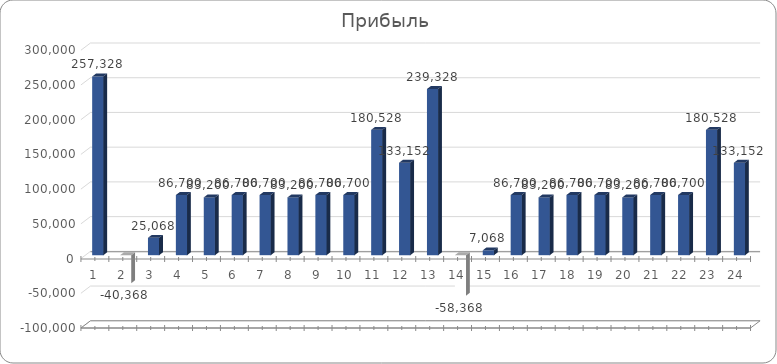
| Category | Series 0 |
|---|---|
| 0 | 257328 |
| 1 | -40368 |
| 2 | 25068 |
| 3 | 86700 |
| 4 | 83200 |
| 5 | 86700 |
| 6 | 86700 |
| 7 | 83200 |
| 8 | 86700 |
| 9 | 86700 |
| 10 | 180528 |
| 11 | 133152 |
| 12 | 239328 |
| 13 | -58368 |
| 14 | 7068 |
| 15 | 86700 |
| 16 | 83200 |
| 17 | 86700 |
| 18 | 86700 |
| 19 | 83200 |
| 20 | 86700 |
| 21 | 86700 |
| 22 | 180528 |
| 23 | 133152 |